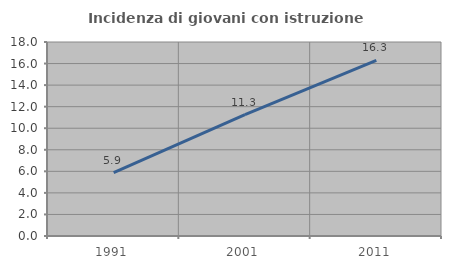
| Category | Incidenza di giovani con istruzione universitaria |
|---|---|
| 1991.0 | 5.882 |
| 2001.0 | 11.258 |
| 2011.0 | 16.304 |